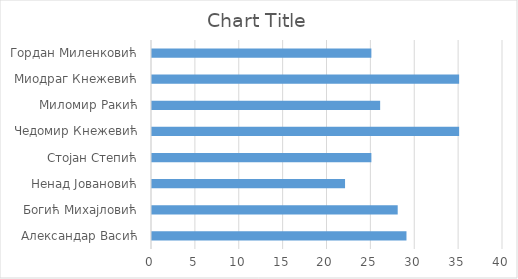
| Category | Series 0 |
|---|---|
| Александар Васић | 29 |
| Богић Михајловић | 28 |
| Ненад Јовановић | 22 |
| Стојан Степић | 25 |
| Чедомир Кнежевић | 35 |
| Миломир Ракић | 26 |
| Миодраг Кнежевић | 35 |
| Гордан Миленковић | 25 |